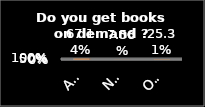
| Category | Series 0 |
|---|---|
| ALWAYS | 0.671 |
| NOT ON DEMAND | 0.076 |
| OCCATIONALLY | 0.253 |